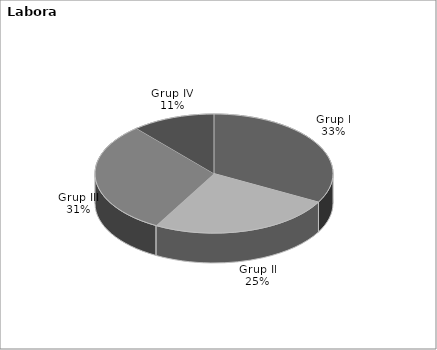
| Category | Series 0 |
|---|---|
| Grup I | 257 |
| Grup II | 196 |
| Grup III | 239 |
| Grup IV | 88 |